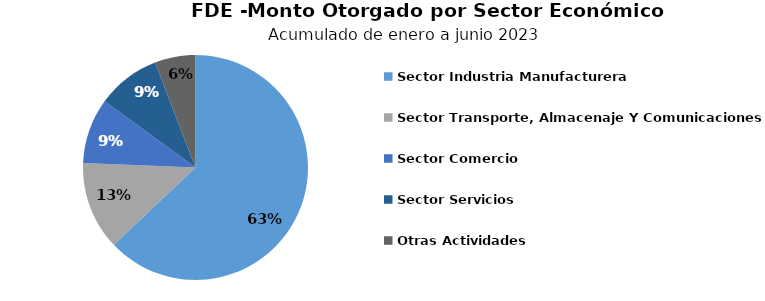
| Category | Monto |
|---|---|
| Sector Industria Manufacturera | 2.87 |
| Sector Transporte, Almacenaje Y Comunicaciones | 0.579 |
| Sector Comercio | 0.428 |
| Sector Servicios | 0.417 |
| Otras Actividades | 0.266 |